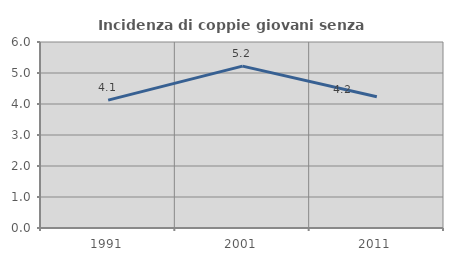
| Category | Incidenza di coppie giovani senza figli |
|---|---|
| 1991.0 | 4.125 |
| 2001.0 | 5.222 |
| 2011.0 | 4.232 |